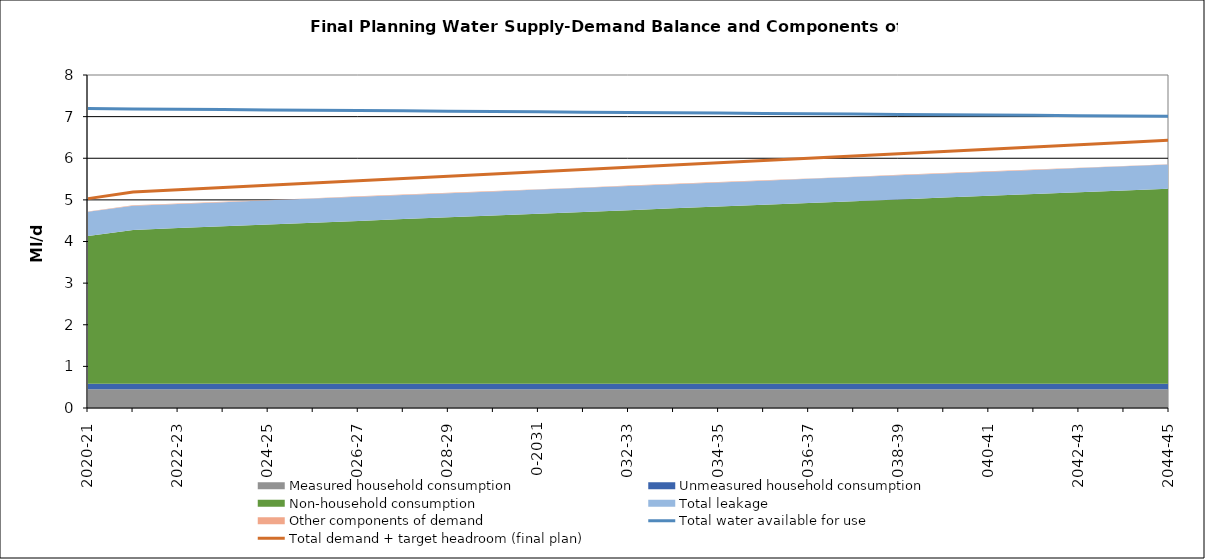
| Category | Total water available for use | Total demand + target headroom (final plan) |
|---|---|---|
| 0 | 7.192 | 5.03 |
| 1 | 7.185 | 5.188 |
| 2 | 7.177 | 5.242 |
| 3 | 7.169 | 5.296 |
| 4 | 7.162 | 5.35 |
| 5 | 7.154 | 5.404 |
| 6 | 7.146 | 5.458 |
| 7 | 7.138 | 5.512 |
| 8 | 7.131 | 5.567 |
| 9 | 7.123 | 5.621 |
| 10 | 7.115 | 5.675 |
| 11 | 7.108 | 5.729 |
| 12 | 7.1 | 5.783 |
| 13 | 7.092 | 5.837 |
| 14 | 7.085 | 5.891 |
| 15 | 7.077 | 5.945 |
| 16 | 7.069 | 5.999 |
| 17 | 7.061 | 6.053 |
| 18 | 7.054 | 6.107 |
| 19 | 7.046 | 6.161 |
| 20 | 7.038 | 6.215 |
| 21 | 7.031 | 6.27 |
| 22 | 7.023 | 6.324 |
| 23 | 7.015 | 6.378 |
| 24 | 7.008 | 6.432 |